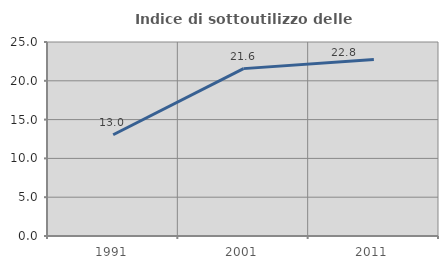
| Category | Indice di sottoutilizzo delle abitazioni  |
|---|---|
| 1991.0 | 13.043 |
| 2001.0 | 21.569 |
| 2011.0 | 22.759 |